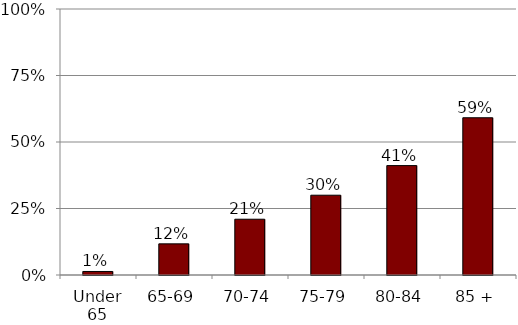
| Category | Series 0 |
|---|---|
| Under 65 | 0.013 |
| 65-69 | 0.117 |
| 70-74 | 0.21 |
| 75-79 | 0.3 |
| 80-84 | 0.411 |
| 85 + | 0.591 |